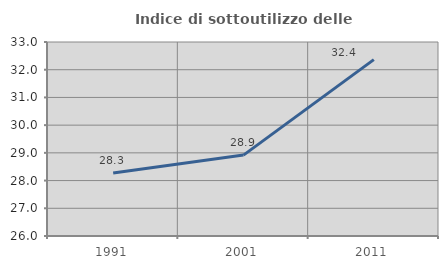
| Category | Indice di sottoutilizzo delle abitazioni  |
|---|---|
| 1991.0 | 28.27 |
| 2001.0 | 28.919 |
| 2011.0 | 32.363 |